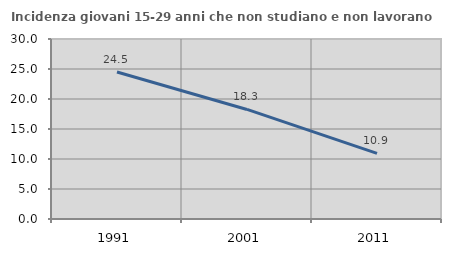
| Category | Incidenza giovani 15-29 anni che non studiano e non lavorano  |
|---|---|
| 1991.0 | 24.501 |
| 2001.0 | 18.261 |
| 2011.0 | 10.938 |